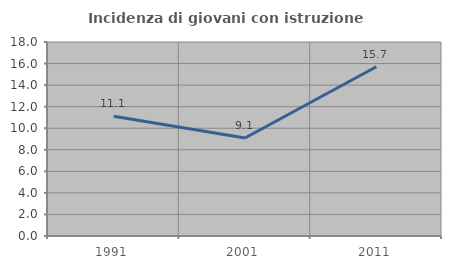
| Category | Incidenza di giovani con istruzione universitaria |
|---|---|
| 1991.0 | 11.111 |
| 2001.0 | 9.091 |
| 2011.0 | 15.702 |